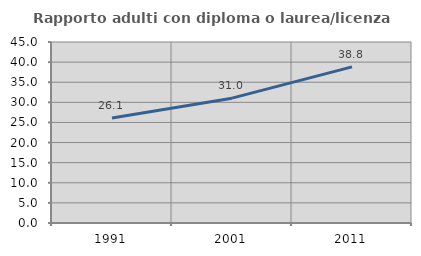
| Category | Rapporto adulti con diploma o laurea/licenza media  |
|---|---|
| 1991.0 | 26.087 |
| 2001.0 | 31.034 |
| 2011.0 | 38.816 |